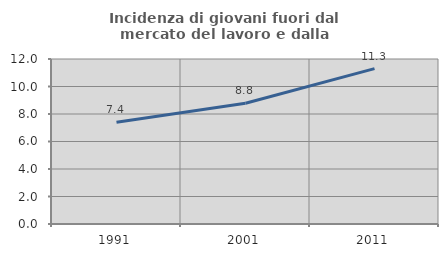
| Category | Incidenza di giovani fuori dal mercato del lavoro e dalla formazione  |
|---|---|
| 1991.0 | 7.402 |
| 2001.0 | 8.78 |
| 2011.0 | 11.297 |